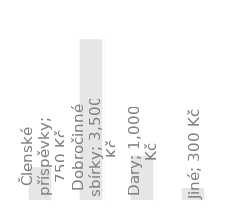
| Category | Roční výnosy |
|---|---|
| Členské příspěvky | 750 |
| Dobročinné sbírky | 3500 |
| Dary | 1000 |
| Jiné | 300 |